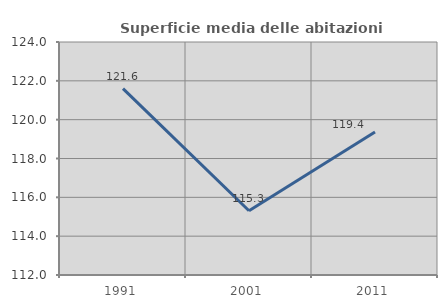
| Category | Superficie media delle abitazioni occupate |
|---|---|
| 1991.0 | 121.598 |
| 2001.0 | 115.31 |
| 2011.0 | 119.362 |